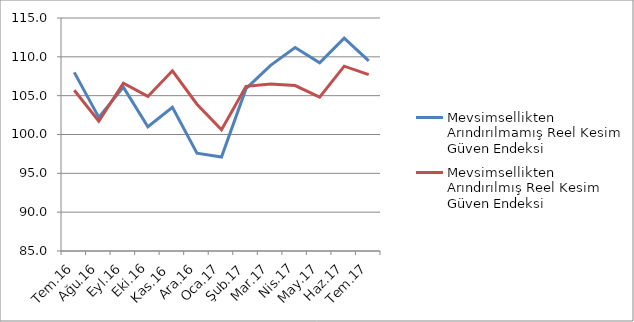
| Category | Mevsimsellikten Arındırılmamış Reel Kesim Güven Endeksi | Mevsimsellikten Arındırılmış Reel Kesim Güven Endeksi |
|---|---|---|
| Tem.16 | 108 | 105.7 |
| Ağu.16 | 102.2 | 101.7 |
| Eyl.16 | 106.1 | 106.6 |
| Eki.16 | 101 | 104.9 |
| Kas.16 | 103.5 | 108.2 |
| Ara.16 | 97.6 | 103.9 |
| Oca.17 | 97.1 | 100.6 |
| Şub.17 | 105.9 | 106.2 |
| Mar.17 | 108.9 | 106.5 |
| Nis.17 | 111.2 | 106.3 |
| May.17 | 109.225 | 104.8 |
| Haz.17 | 112.412 | 108.8 |
| Tem.17 | 109.488 | 107.7 |